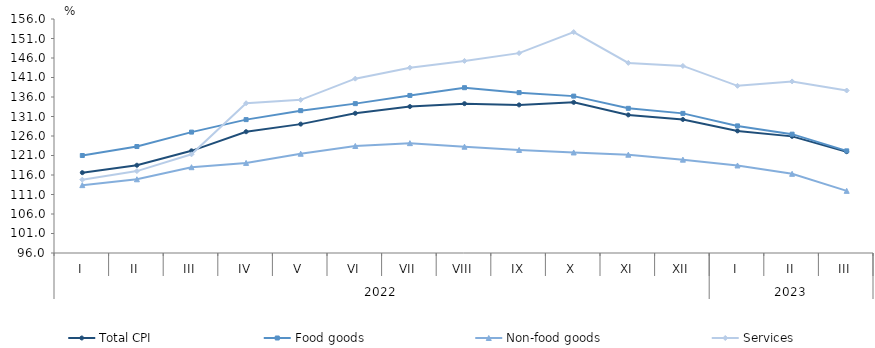
| Category | Total CPI | Food goods | Non-food goods | Services |
|---|---|---|---|---|
| 0 | 116.6 | 121 | 113.4 | 114.8 |
| 1 | 118.5 | 123.3 | 114.9 | 117 |
| 2 | 122.2 | 127 | 118 | 121.3 |
| 3 | 127.1 | 130.2 | 119.1 | 134.4 |
| 4 | 129.047 | 132.5 | 121.45 | 135.267 |
| 5 | 131.827 | 134.301 | 123.443 | 140.701 |
| 6 | 133.547 | 136.399 | 124.168 | 143.511 |
| 7 | 134.294 | 138.387 | 123.256 | 145.253 |
| 8 | 133.971 | 137.121 | 122.424 | 147.248 |
| 9 | 134.625 | 136.226 | 121.779 | 152.646 |
| 10 | 131.406 | 133.093 | 121.201 | 144.742 |
| 11 | 130.241 | 131.801 | 119.936 | 143.965 |
| 12 | 127.307 | 128.59 | 118.441 | 138.865 |
| 13 | 125.905 | 126.472 | 116.307 | 139.99 |
| 14 | 121.977 | 122.19 | 111.932 | 137.666 |